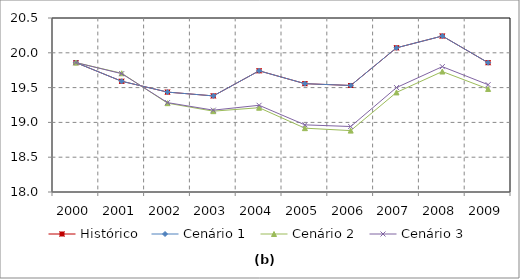
| Category | Histórico | Cenário 1 | Cenário 2 | Cenário 3 |
|---|---|---|---|---|
| 2000.0 | 19.859 | 19.859 | 19.859 | 19.859 |
| 2001.0 | 19.591 | 19.591 | 19.706 | 19.7 |
| 2002.0 | 19.435 | 19.435 | 19.276 | 19.284 |
| 2003.0 | 19.381 | 19.381 | 19.161 | 19.176 |
| 2004.0 | 19.741 | 19.741 | 19.211 | 19.246 |
| 2005.0 | 19.556 | 19.556 | 18.917 | 18.965 |
| 2006.0 | 19.531 | 19.531 | 18.882 | 18.941 |
| 2007.0 | 20.072 | 20.072 | 19.431 | 19.5 |
| 2008.0 | 20.241 | 20.241 | 19.731 | 19.801 |
| 2009.0 | 19.858 | 19.858 | 19.481 | 19.542 |